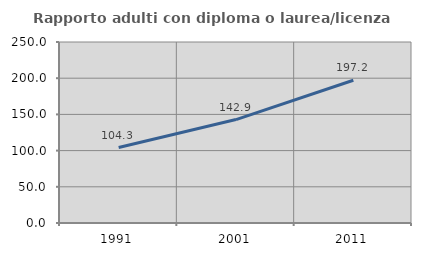
| Category | Rapporto adulti con diploma o laurea/licenza media  |
|---|---|
| 1991.0 | 104.262 |
| 2001.0 | 142.857 |
| 2011.0 | 197.229 |